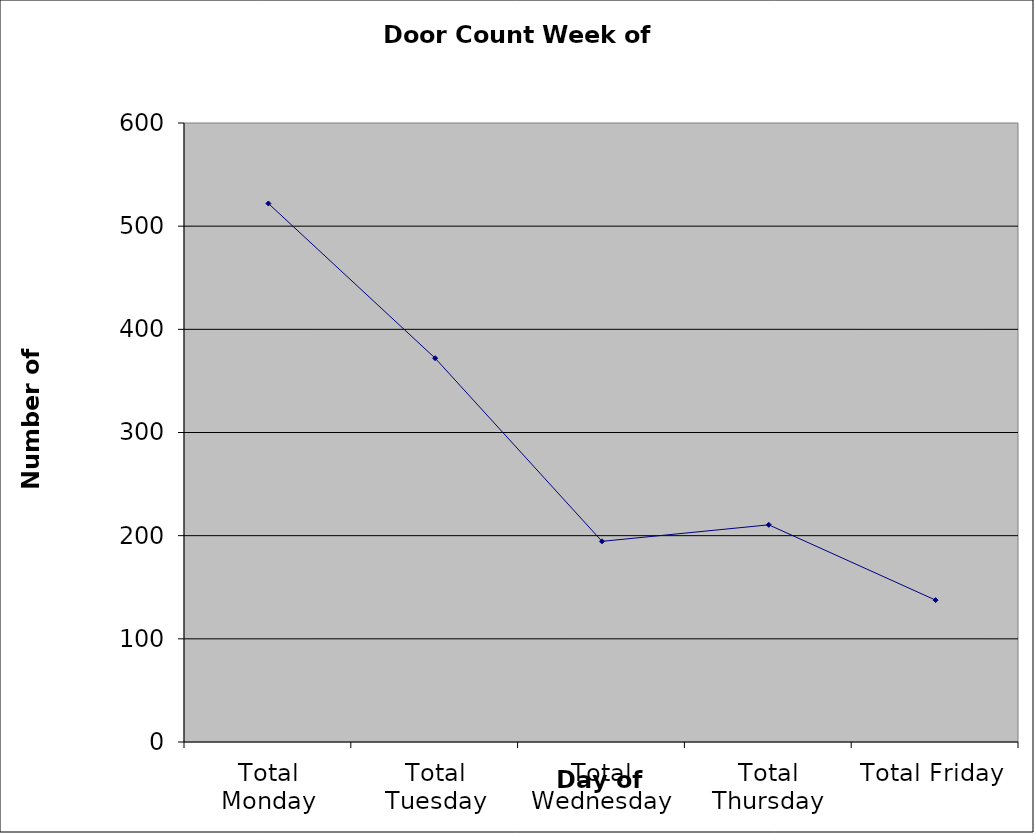
| Category | Series 0 |
|---|---|
| Total Monday | 522 |
| Total Tuesday | 372 |
| Total Wednesday | 194.5 |
| Total Thursday | 210.5 |
| Total Friday | 137.5 |